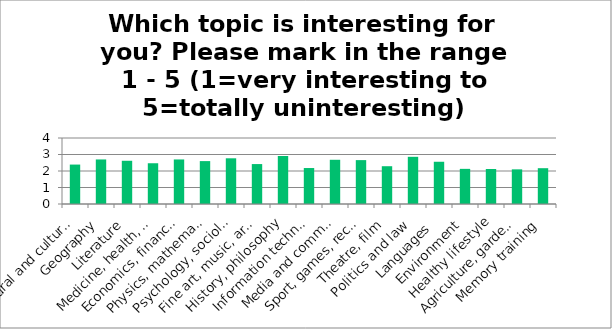
| Category | Weighted Average |
|---|---|
| Natural and cultural monuments with excursion | 2.39 |
| Geography | 2.7 |
| Literature | 2.62 |
| Medicine, health, security | 2.47 |
| Economics, finances | 2.7 |
| Physics, mathematics, and other natural sciences | 2.6 |
| Psychology, sociology and other social sciences | 2.77 |
| Fine art, music, arts and crafts   | 2.42 |
| History, philosophy | 2.91 |
| Information technology, computers, internet, smart phones | 2.18 |
| Media and communication | 2.68 |
| Sport, games, recreation, dance | 2.66 |
| Theatre, film | 2.29 |
| Politics and law | 2.86 |
| Languages  | 2.56 |
| Environment | 2.13 |
| Healthy lifestyle | 2.12 |
| Agriculture, gardening, animal care | 2.1 |
| Memory training | 2.17 |